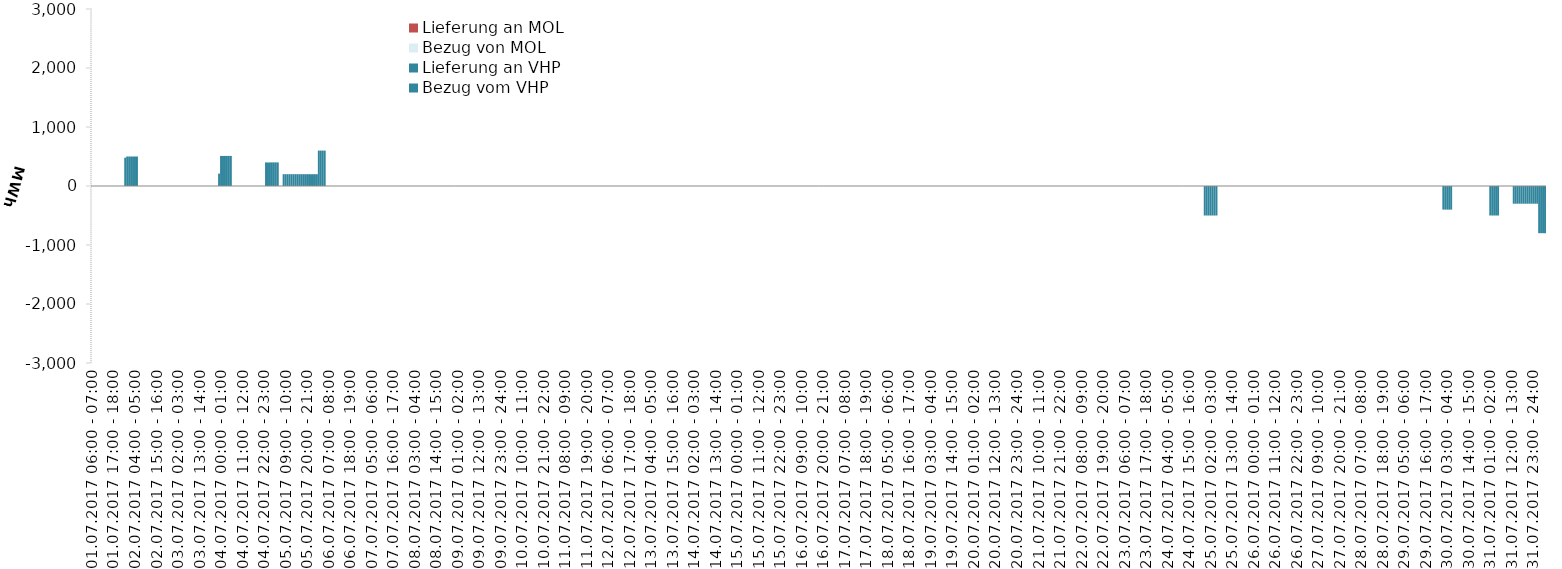
| Category | Bezug vom VHP | Lieferung an VHP | Bezug von MOL | Lieferung an MOL |
|---|---|---|---|---|
| 01.07.2017 06:00 - 07:00 | 0 | 0 | 0 | 0 |
| 01.07.2017 07:00 - 08:00 | 0 | 0 | 0 | 0 |
| 01.07.2017 08:00 - 09:00 | 0 | 0 | 0 | 0 |
| 01.07.2017 09:00 - 10:00 | 0 | 0 | 0 | 0 |
| 01.07.2017 10:00 - 11:00 | 0 | 0 | 0 | 0 |
| 01.07.2017 11:00 - 12:00 | 0 | 0 | 0 | 0 |
| 01.07.2017 12:00 - 13:00 | 0 | 0 | 0 | 0 |
| 01.07.2017 13:00 - 14:00 | 0 | 0 | 0 | 0 |
| 01.07.2017 14:00 - 15:00 | 0 | 0 | 0 | 0 |
| 01.07.2017 15:00 - 16:00 | 0 | 0 | 0 | 0 |
| 01.07.2017 16:00 - 17:00 | 0 | 0 | 0 | 0 |
| 01.07.2017 17:00 - 18:00 | 0 | 0 | 0 | 0 |
| 01.07.2017 18:00 - 19:00 | 0 | 0 | 0 | 0 |
| 01.07.2017 19:00 - 20:00 | 0 | 0 | 0 | 0 |
| 01.07.2017 20:00 - 21:00 | 0 | 0 | 0 | 0 |
| 01.07.2017 21:00 - 22:00 | 0 | 0 | 0 | 0 |
| 01.07.2017 22:00 - 23:00 | 0 | 0 | 0 | 0 |
| 01.07.2017 23:00 - 24:00 | 480 | 0 | 0 | 0 |
| 02.07.2017 00:00 - 01:00 | 500 | 0 | 0 | 0 |
| 02.07.2017 01:00 - 02:00 | 500 | 0 | 0 | 0 |
| 02.07.2017 02:00 - 03:00 | 500 | 0 | 0 | 0 |
| 02.07.2017 03:00 - 04:00 | 500 | 0 | 0 | 0 |
| 02.07.2017 04:00 - 05:00 | 500 | 0 | 0 | 0 |
| 02.07.2017 05:00 - 06:00 | 500 | 0 | 0 | 0 |
| 02.07.2017 06:00 - 07:00 | 0 | 0 | 0 | 0 |
| 02.07.2017 07:00 - 08:00 | 0 | 0 | 0 | 0 |
| 02.07.2017 08:00 - 09:00 | 0 | 0 | 0 | 0 |
| 02.07.2017 09:00 - 10:00 | 0 | 0 | 0 | 0 |
| 02.07.2017 10:00 - 11:00 | 0 | 0 | 0 | 0 |
| 02.07.2017 11:00 - 12:00 | 0 | 0 | 0 | 0 |
| 02.07.2017 12:00 - 13:00 | 0 | 0 | 0 | 0 |
| 02.07.2017 13:00 - 14:00 | 0 | 0 | 0 | 0 |
| 02.07.2017 14:00 - 15:00 | 0 | 0 | 0 | 0 |
| 02.07.2017 15:00 - 16:00 | 0 | 0 | 0 | 0 |
| 02.07.2017 16:00 - 17:00 | 0 | 0 | 0 | 0 |
| 02.07.2017 17:00 - 18:00 | 0 | 0 | 0 | 0 |
| 02.07.2017 18:00 - 19:00 | 0 | 0 | 0 | 0 |
| 02.07.2017 19:00 - 20:00 | 0 | 0 | 0 | 0 |
| 02.07.2017 20:00 - 21:00 | 0 | 0 | 0 | 0 |
| 02.07.2017 21:00 - 22:00 | 0 | 0 | 0 | 0 |
| 02.07.2017 22:00 - 23:00 | 0 | 0 | 0 | 0 |
| 02.07.2017 23:00 - 24:00 | 0 | 0 | 0 | 0 |
| 03.07.2017 00:00 - 01:00 | 0 | 0 | 0 | 0 |
| 03.07.2017 01:00 - 02:00 | 0 | 0 | 0 | 0 |
| 03.07.2017 02:00 - 03:00 | 0 | 0 | 0 | 0 |
| 03.07.2017 03:00 - 04:00 | 0 | 0 | 0 | 0 |
| 03.07.2017 04:00 - 05:00 | 0 | 0 | 0 | 0 |
| 03.07.2017 05:00 - 06:00 | 0 | 0 | 0 | 0 |
| 03.07.2017 06:00 - 07:00 | 0 | 0 | 0 | 0 |
| 03.07.2017 07:00 - 08:00 | 0 | 0 | 0 | 0 |
| 03.07.2017 08:00 - 09:00 | 0 | 0 | 0 | 0 |
| 03.07.2017 09:00 - 10:00 | 0 | 0 | 0 | 0 |
| 03.07.2017 10:00 - 11:00 | 0 | 0 | 0 | 0 |
| 03.07.2017 11:00 - 12:00 | 0 | 0 | 0 | 0 |
| 03.07.2017 12:00 - 13:00 | 0 | 0 | 0 | 0 |
| 03.07.2017 13:00 - 14:00 | 0 | 0 | 0 | 0 |
| 03.07.2017 14:00 - 15:00 | 0 | 0 | 0 | 0 |
| 03.07.2017 15:00 - 16:00 | 0 | 0 | 0 | 0 |
| 03.07.2017 16:00 - 17:00 | 0 | 0 | 0 | 0 |
| 03.07.2017 17:00 - 18:00 | 0 | 0 | 0 | 0 |
| 03.07.2017 18:00 - 19:00 | 0 | 0 | 0 | 0 |
| 03.07.2017 19:00 - 20:00 | 0 | 0 | 0 | 0 |
| 03.07.2017 20:00 - 21:00 | 0 | 0 | 0 | 0 |
| 03.07.2017 21:00 - 22:00 | 0 | 0 | 0 | 0 |
| 03.07.2017 22:00 - 23:00 | 0 | 0 | 0 | 0 |
| 03.07.2017 23:00 - 24:00 | 210 | 0 | 0 | 0 |
| 04.07.2017 00:00 - 01:00 | 510 | 0 | 0 | 0 |
| 04.07.2017 01:00 - 02:00 | 510 | 0 | 0 | 0 |
| 04.07.2017 02:00 - 03:00 | 510 | 0 | 0 | 0 |
| 04.07.2017 03:00 - 04:00 | 510 | 0 | 0 | 0 |
| 04.07.2017 04:00 - 05:00 | 510 | 0 | 0 | 0 |
| 04.07.2017 05:00 - 06:00 | 510 | 0 | 0 | 0 |
| 04.07.2017 06:00 - 07:00 | 0 | 0 | 0 | 0 |
| 04.07.2017 07:00 - 08:00 | 0 | 0 | 0 | 0 |
| 04.07.2017 08:00 - 09:00 | 0 | 0 | 0 | 0 |
| 04.07.2017 09:00 - 10:00 | 0 | 0 | 0 | 0 |
| 04.07.2017 10:00 - 11:00 | 0 | 0 | 0 | 0 |
| 04.07.2017 11:00 - 12:00 | 0 | 0 | 0 | 0 |
| 04.07.2017 12:00 - 13:00 | 0 | 0 | 0 | 0 |
| 04.07.2017 13:00 - 14:00 | 0 | 0 | 0 | 0 |
| 04.07.2017 14:00 - 15:00 | 0 | 0 | 0 | 0 |
| 04.07.2017 15:00 - 16:00 | 0 | 0 | 0 | 0 |
| 04.07.2017 16:00 - 17:00 | 0 | 0 | 0 | 0 |
| 04.07.2017 17:00 - 18:00 | 0 | 0 | 0 | 0 |
| 04.07.2017 18:00 - 19:00 | 0 | 0 | 0 | 0 |
| 04.07.2017 19:00 - 20:00 | 0 | 0 | 0 | 0 |
| 04.07.2017 20:00 - 21:00 | 0 | 0 | 0 | 0 |
| 04.07.2017 21:00 - 22:00 | 0 | 0 | 0 | 0 |
| 04.07.2017 22:00 - 23:00 | 0 | 0 | 0 | 0 |
| 04.07.2017 23:00 - 24:00 | 400 | 0 | 0 | 0 |
| 05.07.2017 00:00 - 01:00 | 400 | 0 | 0 | 0 |
| 05.07.2017 01:00 - 02:00 | 400 | 0 | 0 | 0 |
| 05.07.2017 02:00 - 03:00 | 400 | 0 | 0 | 0 |
| 05.07.2017 03:00 - 04:00 | 400 | 0 | 0 | 0 |
| 05.07.2017 04:00 - 05:00 | 400 | 0 | 0 | 0 |
| 05.07.2017 05:00 - 06:00 | 400 | 0 | 0 | 0 |
| 05.07.2017 06:00 - 07:00 | 0 | 0 | 0 | 0 |
| 05.07.2017 07:00 - 08:00 | 0 | 0 | 0 | 0 |
| 05.07.2017 08:00 - 09:00 | 200 | 0 | 0 | 0 |
| 05.07.2017 09:00 - 10:00 | 200 | 0 | 0 | 0 |
| 05.07.2017 10:00 - 11:00 | 200 | 0 | 0 | 0 |
| 05.07.2017 11:00 - 12:00 | 200 | 0 | 0 | 0 |
| 05.07.2017 12:00 - 13:00 | 200 | 0 | 0 | 0 |
| 05.07.2017 13:00 - 14:00 | 200 | 0 | 0 | 0 |
| 05.07.2017 14:00 - 15:00 | 200 | 0 | 0 | 0 |
| 05.07.2017 15:00 - 16:00 | 200 | 0 | 0 | 0 |
| 05.07.2017 16:00 - 17:00 | 200 | 0 | 0 | 0 |
| 05.07.2017 17:00 - 18:00 | 200 | 0 | 0 | 0 |
| 05.07.2017 18:00 - 19:00 | 200 | 0 | 0 | 0 |
| 05.07.2017 19:00 - 20:00 | 200 | 0 | 0 | 0 |
| 05.07.2017 20:00 - 21:00 | 200 | 0 | 0 | 0 |
| 05.07.2017 21:00 - 22:00 | 200 | 0 | 0 | 0 |
| 05.07.2017 22:00 - 23:00 | 200 | 0 | 0 | 0 |
| 05.07.2017 23:00 - 24:00 | 200 | 0 | 0 | 0 |
| 06.07.2017 00:00 - 01:00 | 200 | 0 | 0 | 0 |
| 06.07.2017 01:00 - 02:00 | 200 | 0 | 0 | 0 |
| 06.07.2017 02:00 - 03:00 | 600 | 0 | 0 | 0 |
| 06.07.2017 03:00 - 04:00 | 600 | 0 | 0 | 0 |
| 06.07.2017 04:00 - 05:00 | 600 | 0 | 0 | 0 |
| 06.07.2017 05:00 - 06:00 | 600 | 0 | 0 | 0 |
| 06.07.2017 06:00 - 07:00 | 0 | 0 | 0 | 0 |
| 06.07.2017 07:00 - 08:00 | 0 | 0 | 0 | 0 |
| 06.07.2017 08:00 - 09:00 | 0 | 0 | 0 | 0 |
| 06.07.2017 09:00 - 10:00 | 0 | 0 | 0 | 0 |
| 06.07.2017 10:00 - 11:00 | 0 | 0 | 0 | 0 |
| 06.07.2017 11:00 - 12:00 | 0 | 0 | 0 | 0 |
| 06.07.2017 12:00 - 13:00 | 0 | 0 | 0 | 0 |
| 06.07.2017 13:00 - 14:00 | 0 | 0 | 0 | 0 |
| 06.07.2017 14:00 - 15:00 | 0 | 0 | 0 | 0 |
| 06.07.2017 15:00 - 16:00 | 0 | 0 | 0 | 0 |
| 06.07.2017 16:00 - 17:00 | 0 | 0 | 0 | 0 |
| 06.07.2017 17:00 - 18:00 | 0 | 0 | 0 | 0 |
| 06.07.2017 18:00 - 19:00 | 0 | 0 | 0 | 0 |
| 06.07.2017 19:00 - 20:00 | 0 | 0 | 0 | 0 |
| 06.07.2017 20:00 - 21:00 | 0 | 0 | 0 | 0 |
| 06.07.2017 21:00 - 22:00 | 0 | 0 | 0 | 0 |
| 06.07.2017 22:00 - 23:00 | 0 | 0 | 0 | 0 |
| 06.07.2017 23:00 - 24:00 | 0 | 0 | 0 | 0 |
| 07.07.2017 00:00 - 01:00 | 0 | 0 | 0 | 0 |
| 07.07.2017 01:00 - 02:00 | 0 | 0 | 0 | 0 |
| 07.07.2017 02:00 - 03:00 | 0 | 0 | 0 | 0 |
| 07.07.2017 03:00 - 04:00 | 0 | 0 | 0 | 0 |
| 07.07.2017 04:00 - 05:00 | 0 | 0 | 0 | 0 |
| 07.07.2017 05:00 - 06:00 | 0 | 0 | 0 | 0 |
| 07.07.2017 06:00 - 07:00 | 0 | 0 | 0 | 0 |
| 07.07.2017 07:00 - 08:00 | 0 | 0 | 0 | 0 |
| 07.07.2017 08:00 - 09:00 | 0 | 0 | 0 | 0 |
| 07.07.2017 09:00 - 10:00 | 0 | 0 | 0 | 0 |
| 07.07.2017 10:00 - 11:00 | 0 | 0 | 0 | 0 |
| 07.07.2017 11:00 - 12:00 | 0 | 0 | 0 | 0 |
| 07.07.2017 12:00 - 13:00 | 0 | 0 | 0 | 0 |
| 07.07.2017 13:00 - 14:00 | 0 | 0 | 0 | 0 |
| 07.07.2017 14:00 - 15:00 | 0 | 0 | 0 | 0 |
| 07.07.2017 15:00 - 16:00 | 0 | 0 | 0 | 0 |
| 07.07.2017 16:00 - 17:00 | 0 | 0 | 0 | 0 |
| 07.07.2017 17:00 - 18:00 | 0 | 0 | 0 | 0 |
| 07.07.2017 18:00 - 19:00 | 0 | 0 | 0 | 0 |
| 07.07.2017 19:00 - 20:00 | 0 | 0 | 0 | 0 |
| 07.07.2017 20:00 - 21:00 | 0 | 0 | 0 | 0 |
| 07.07.2017 21:00 - 22:00 | 0 | 0 | 0 | 0 |
| 07.07.2017 22:00 - 23:00 | 0 | 0 | 0 | 0 |
| 07.07.2017 23:00 - 24:00 | 0 | 0 | 0 | 0 |
| 08.07.2017 00:00 - 01:00 | 0 | 0 | 0 | 0 |
| 08.07.2017 01:00 - 02:00 | 0 | 0 | 0 | 0 |
| 08.07.2017 02:00 - 03:00 | 0 | 0 | 0 | 0 |
| 08.07.2017 03:00 - 04:00 | 0 | 0 | 0 | 0 |
| 08.07.2017 04:00 - 05:00 | 0 | 0 | 0 | 0 |
| 08.07.2017 05:00 - 06:00 | 0 | 0 | 0 | 0 |
| 08.07.2017 06:00 - 07:00 | 0 | 0 | 0 | 0 |
| 08.07.2017 07:00 - 08:00 | 0 | 0 | 0 | 0 |
| 08.07.2017 08:00 - 09:00 | 0 | 0 | 0 | 0 |
| 08.07.2017 09:00 - 10:00 | 0 | 0 | 0 | 0 |
| 08.07.2017 10:00 - 11:00 | 0 | 0 | 0 | 0 |
| 08.07.2017 11:00 - 12:00 | 0 | 0 | 0 | 0 |
| 08.07.2017 12:00 - 13:00 | 0 | 0 | 0 | 0 |
| 08.07.2017 13:00 - 14:00 | 0 | 0 | 0 | 0 |
| 08.07.2017 14:00 - 15:00 | 0 | 0 | 0 | 0 |
| 08.07.2017 15:00 - 16:00 | 0 | 0 | 0 | 0 |
| 08.07.2017 16:00 - 17:00 | 0 | 0 | 0 | 0 |
| 08.07.2017 17:00 - 18:00 | 0 | 0 | 0 | 0 |
| 08.07.2017 18:00 - 19:00 | 0 | 0 | 0 | 0 |
| 08.07.2017 19:00 - 20:00 | 0 | 0 | 0 | 0 |
| 08.07.2017 20:00 - 21:00 | 0 | 0 | 0 | 0 |
| 08.07.2017 21:00 - 22:00 | 0 | 0 | 0 | 0 |
| 08.07.2017 22:00 - 23:00 | 0 | 0 | 0 | 0 |
| 08.07.2017 23:00 - 24:00 | 0 | 0 | 0 | 0 |
| 09.07.2017 00:00 - 01:00 | 0 | 0 | 0 | 0 |
| 09.07.2017 01:00 - 02:00 | 0 | 0 | 0 | 0 |
| 09.07.2017 02:00 - 03:00 | 0 | 0 | 0 | 0 |
| 09.07.2017 03:00 - 04:00 | 0 | 0 | 0 | 0 |
| 09.07.2017 04:00 - 05:00 | 0 | 0 | 0 | 0 |
| 09.07.2017 05:00 - 06:00 | 0 | 0 | 0 | 0 |
| 09.07.2017 06:00 - 07:00 | 0 | 0 | 0 | 0 |
| 09.07.2017 07:00 - 08:00 | 0 | 0 | 0 | 0 |
| 09.07.2017 08:00 - 09:00 | 0 | 0 | 0 | 0 |
| 09.07.2017 09:00 - 10:00 | 0 | 0 | 0 | 0 |
| 09.07.2017 10:00 - 11:00 | 0 | 0 | 0 | 0 |
| 09.07.2017 11:00 - 12:00 | 0 | 0 | 0 | 0 |
| 09.07.2017 12:00 - 13:00 | 0 | 0 | 0 | 0 |
| 09.07.2017 13:00 - 14:00 | 0 | 0 | 0 | 0 |
| 09.07.2017 14:00 - 15:00 | 0 | 0 | 0 | 0 |
| 09.07.2017 15:00 - 16:00 | 0 | 0 | 0 | 0 |
| 09.07.2017 16:00 - 17:00 | 0 | 0 | 0 | 0 |
| 09.07.2017 17:00 - 18:00 | 0 | 0 | 0 | 0 |
| 09.07.2017 18:00 - 19:00 | 0 | 0 | 0 | 0 |
| 09.07.2017 19:00 - 20:00 | 0 | 0 | 0 | 0 |
| 09.07.2017 20:00 - 21:00 | 0 | 0 | 0 | 0 |
| 09.07.2017 21:00 - 22:00 | 0 | 0 | 0 | 0 |
| 09.07.2017 22:00 - 23:00 | 0 | 0 | 0 | 0 |
| 09.07.2017 23:00 - 24:00 | 0 | 0 | 0 | 0 |
| 10.07.2017 00:00 - 01:00 | 0 | 0 | 0 | 0 |
| 10.07.2017 01:00 - 02:00 | 0 | 0 | 0 | 0 |
| 10.07.2017 02:00 - 03:00 | 0 | 0 | 0 | 0 |
| 10.07.2017 03:00 - 04:00 | 0 | 0 | 0 | 0 |
| 10.07.2017 04:00 - 05:00 | 0 | 0 | 0 | 0 |
| 10.07.2017 05:00 - 06:00 | 0 | 0 | 0 | 0 |
| 10.07.2017 06:00 - 07:00 | 0 | 0 | 0 | 0 |
| 10.07.2017 07:00 - 08:00 | 0 | 0 | 0 | 0 |
| 10.07.2017 08:00 - 09:00 | 0 | 0 | 0 | 0 |
| 10.07.2017 09:00 - 10:00 | 0 | 0 | 0 | 0 |
| 10.07.2017 10:00 - 11:00 | 0 | 0 | 0 | 0 |
| 10.07.2017 11:00 - 12:00 | 0 | 0 | 0 | 0 |
| 10.07.2017 12:00 - 13:00 | 0 | 0 | 0 | 0 |
| 10.07.2017 13:00 - 14:00 | 0 | 0 | 0 | 0 |
| 10.07.2017 14:00 - 15:00 | 0 | 0 | 0 | 0 |
| 10.07.2017 15:00 - 16:00 | 0 | 0 | 0 | 0 |
| 10.07.2017 16:00 - 17:00 | 0 | 0 | 0 | 0 |
| 10.07.2017 17:00 - 18:00 | 0 | 0 | 0 | 0 |
| 10.07.2017 18:00 - 19:00 | 0 | 0 | 0 | 0 |
| 10.07.2017 19:00 - 20:00 | 0 | 0 | 0 | 0 |
| 10.07.2017 20:00 - 21:00 | 0 | 0 | 0 | 0 |
| 10.07.2017 21:00 - 22:00 | 0 | 0 | 0 | 0 |
| 10.07.2017 22:00 - 23:00 | 0 | 0 | 0 | 0 |
| 10.07.2017 23:00 - 24:00 | 0 | 0 | 0 | 0 |
| 11.07.2017 00:00 - 01:00 | 0 | 0 | 0 | 0 |
| 11.07.2017 01:00 - 02:00 | 0 | 0 | 0 | 0 |
| 11.07.2017 02:00 - 03:00 | 0 | 0 | 0 | 0 |
| 11.07.2017 03:00 - 04:00 | 0 | 0 | 0 | 0 |
| 11.07.2017 04:00 - 05:00 | 0 | 0 | 0 | 0 |
| 11.07.2017 05:00 - 06:00 | 0 | 0 | 0 | 0 |
| 11.07.2017 06:00 - 07:00 | 0 | 0 | 0 | 0 |
| 11.07.2017 07:00 - 08:00 | 0 | 0 | 0 | 0 |
| 11.07.2017 08:00 - 09:00 | 0 | 0 | 0 | 0 |
| 11.07.2017 09:00 - 10:00 | 0 | 0 | 0 | 0 |
| 11.07.2017 10:00 - 11:00 | 0 | 0 | 0 | 0 |
| 11.07.2017 11:00 - 12:00 | 0 | 0 | 0 | 0 |
| 11.07.2017 12:00 - 13:00 | 0 | 0 | 0 | 0 |
| 11.07.2017 13:00 - 14:00 | 0 | 0 | 0 | 0 |
| 11.07.2017 14:00 - 15:00 | 0 | 0 | 0 | 0 |
| 11.07.2017 15:00 - 16:00 | 0 | 0 | 0 | 0 |
| 11.07.2017 16:00 - 17:00 | 0 | 0 | 0 | 0 |
| 11.07.2017 17:00 - 18:00 | 0 | 0 | 0 | 0 |
| 11.07.2017 18:00 - 19:00 | 0 | 0 | 0 | 0 |
| 11.07.2017 19:00 - 20:00 | 0 | 0 | 0 | 0 |
| 11.07.2017 20:00 - 21:00 | 0 | 0 | 0 | 0 |
| 11.07.2017 21:00 - 22:00 | 0 | 0 | 0 | 0 |
| 11.07.2017 22:00 - 23:00 | 0 | 0 | 0 | 0 |
| 11.07.2017 23:00 - 24:00 | 0 | 0 | 0 | 0 |
| 12.07.2017 00:00 - 01:00 | 0 | 0 | 0 | 0 |
| 12.07.2017 01:00 - 02:00 | 0 | 0 | 0 | 0 |
| 12.07.2017 02:00 - 03:00 | 0 | 0 | 0 | 0 |
| 12.07.2017 03:00 - 04:00 | 0 | 0 | 0 | 0 |
| 12.07.2017 04:00 - 05:00 | 0 | 0 | 0 | 0 |
| 12.07.2017 05:00 - 06:00 | 0 | 0 | 0 | 0 |
| 12.07.2017 06:00 - 07:00 | 0 | 0 | 0 | 0 |
| 12.07.2017 07:00 - 08:00 | 0 | 0 | 0 | 0 |
| 12.07.2017 08:00 - 09:00 | 0 | 0 | 0 | 0 |
| 12.07.2017 09:00 - 10:00 | 0 | 0 | 0 | 0 |
| 12.07.2017 10:00 - 11:00 | 0 | 0 | 0 | 0 |
| 12.07.2017 11:00 - 12:00 | 0 | 0 | 0 | 0 |
| 12.07.2017 12:00 - 13:00 | 0 | 0 | 0 | 0 |
| 12.07.2017 13:00 - 14:00 | 0 | 0 | 0 | 0 |
| 12.07.2017 14:00 - 15:00 | 0 | 0 | 0 | 0 |
| 12.07.2017 15:00 - 16:00 | 0 | 0 | 0 | 0 |
| 12.07.2017 16:00 - 17:00 | 0 | 0 | 0 | 0 |
| 12.07.2017 17:00 - 18:00 | 0 | 0 | 0 | 0 |
| 12.07.2017 18:00 - 19:00 | 0 | 0 | 0 | 0 |
| 12.07.2017 19:00 - 20:00 | 0 | 0 | 0 | 0 |
| 12.07.2017 20:00 - 21:00 | 0 | 0 | 0 | 0 |
| 12.07.2017 21:00 - 22:00 | 0 | 0 | 0 | 0 |
| 12.07.2017 22:00 - 23:00 | 0 | 0 | 0 | 0 |
| 12.07.2017 23:00 - 24:00 | 0 | 0 | 0 | 0 |
| 13.07.2017 00:00 - 01:00 | 0 | 0 | 0 | 0 |
| 13.07.2017 01:00 - 02:00 | 0 | 0 | 0 | 0 |
| 13.07.2017 02:00 - 03:00 | 0 | 0 | 0 | 0 |
| 13.07.2017 03:00 - 04:00 | 0 | 0 | 0 | 0 |
| 13.07.2017 04:00 - 05:00 | 0 | 0 | 0 | 0 |
| 13.07.2017 05:00 - 06:00 | 0 | 0 | 0 | 0 |
| 13.07.2017 06:00 - 07:00 | 0 | 0 | 0 | 0 |
| 13.07.2017 07:00 - 08:00 | 0 | 0 | 0 | 0 |
| 13.07.2017 08:00 - 09:00 | 0 | 0 | 0 | 0 |
| 13.07.2017 09:00 - 10:00 | 0 | 0 | 0 | 0 |
| 13.07.2017 10:00 - 11:00 | 0 | 0 | 0 | 0 |
| 13.07.2017 11:00 - 12:00 | 0 | 0 | 0 | 0 |
| 13.07.2017 12:00 - 13:00 | 0 | 0 | 0 | 0 |
| 13.07.2017 13:00 - 14:00 | 0 | 0 | 0 | 0 |
| 13.07.2017 14:00 - 15:00 | 0 | 0 | 0 | 0 |
| 13.07.2017 15:00 - 16:00 | 0 | 0 | 0 | 0 |
| 13.07.2017 16:00 - 17:00 | 0 | 0 | 0 | 0 |
| 13.07.2017 17:00 - 18:00 | 0 | 0 | 0 | 0 |
| 13.07.2017 18:00 - 19:00 | 0 | 0 | 0 | 0 |
| 13.07.2017 19:00 - 20:00 | 0 | 0 | 0 | 0 |
| 13.07.2017 20:00 - 21:00 | 0 | 0 | 0 | 0 |
| 13.07.2017 21:00 - 22:00 | 0 | 0 | 0 | 0 |
| 13.07.2017 22:00 - 23:00 | 0 | 0 | 0 | 0 |
| 13.07.2017 23:00 - 24:00 | 0 | 0 | 0 | 0 |
| 14.07.2017 00:00 - 01:00 | 0 | 0 | 0 | 0 |
| 14.07.2017 01:00 - 02:00 | 0 | 0 | 0 | 0 |
| 14.07.2017 02:00 - 03:00 | 0 | 0 | 0 | 0 |
| 14.07.2017 03:00 - 04:00 | 0 | 0 | 0 | 0 |
| 14.07.2017 04:00 - 05:00 | 0 | 0 | 0 | 0 |
| 14.07.2017 05:00 - 06:00 | 0 | 0 | 0 | 0 |
| 14.07.2017 06:00 - 07:00 | 0 | 0 | 0 | 0 |
| 14.07.2017 07:00 - 08:00 | 0 | 0 | 0 | 0 |
| 14.07.2017 08:00 - 09:00 | 0 | 0 | 0 | 0 |
| 14.07.2017 09:00 - 10:00 | 0 | 0 | 0 | 0 |
| 14.07.2017 10:00 - 11:00 | 0 | 0 | 0 | 0 |
| 14.07.2017 11:00 - 12:00 | 0 | 0 | 0 | 0 |
| 14.07.2017 12:00 - 13:00 | 0 | 0 | 0 | 0 |
| 14.07.2017 13:00 - 14:00 | 0 | 0 | 0 | 0 |
| 14.07.2017 14:00 - 15:00 | 0 | 0 | 0 | 0 |
| 14.07.2017 15:00 - 16:00 | 0 | 0 | 0 | 0 |
| 14.07.2017 16:00 - 17:00 | 0 | 0 | 0 | 0 |
| 14.07.2017 17:00 - 18:00 | 0 | 0 | 0 | 0 |
| 14.07.2017 18:00 - 19:00 | 0 | 0 | 0 | 0 |
| 14.07.2017 19:00 - 20:00 | 0 | 0 | 0 | 0 |
| 14.07.2017 20:00 - 21:00 | 0 | 0 | 0 | 0 |
| 14.07.2017 21:00 - 22:00 | 0 | 0 | 0 | 0 |
| 14.07.2017 22:00 - 23:00 | 0 | 0 | 0 | 0 |
| 14.07.2017 23:00 - 24:00 | 0 | 0 | 0 | 0 |
| 15.07.2017 00:00 - 01:00 | 0 | 0 | 0 | 0 |
| 15.07.2017 01:00 - 02:00 | 0 | 0 | 0 | 0 |
| 15.07.2017 02:00 - 03:00 | 0 | 0 | 0 | 0 |
| 15.07.2017 03:00 - 04:00 | 0 | 0 | 0 | 0 |
| 15.07.2017 04:00 - 05:00 | 0 | 0 | 0 | 0 |
| 15.07.2017 05:00 - 06:00 | 0 | 0 | 0 | 0 |
| 15.07.2017 06:00 - 07:00 | 0 | 0 | 0 | 0 |
| 15.07.2017 07:00 - 08:00 | 0 | 0 | 0 | 0 |
| 15.07.2017 08:00 - 09:00 | 0 | 0 | 0 | 0 |
| 15.07.2017 09:00 - 10:00 | 0 | 0 | 0 | 0 |
| 15.07.2017 10:00 - 11:00 | 0 | 0 | 0 | 0 |
| 15.07.2017 11:00 - 12:00 | 0 | 0 | 0 | 0 |
| 15.07.2017 12:00 - 13:00 | 0 | 0 | 0 | 0 |
| 15.07.2017 13:00 - 14:00 | 0 | 0 | 0 | 0 |
| 15.07.2017 14:00 - 15:00 | 0 | 0 | 0 | 0 |
| 15.07.2017 15:00 - 16:00 | 0 | 0 | 0 | 0 |
| 15.07.2017 16:00 - 17:00 | 0 | 0 | 0 | 0 |
| 15.07.2017 17:00 - 18:00 | 0 | 0 | 0 | 0 |
| 15.07.2017 18:00 - 19:00 | 0 | 0 | 0 | 0 |
| 15.07.2017 19:00 - 20:00 | 0 | 0 | 0 | 0 |
| 15.07.2017 20:00 - 21:00 | 0 | 0 | 0 | 0 |
| 15.07.2017 21:00 - 22:00 | 0 | 0 | 0 | 0 |
| 15.07.2017 22:00 - 23:00 | 0 | 0 | 0 | 0 |
| 15.07.2017 23:00 - 24:00 | 0 | 0 | 0 | 0 |
| 16.07.2017 00:00 - 01:00 | 0 | 0 | 0 | 0 |
| 16.07.2017 01:00 - 02:00 | 0 | 0 | 0 | 0 |
| 16.07.2017 02:00 - 03:00 | 0 | 0 | 0 | 0 |
| 16.07.2017 03:00 - 04:00 | 0 | 0 | 0 | 0 |
| 16.07.2017 04:00 - 05:00 | 0 | 0 | 0 | 0 |
| 16.07.2017 05:00 - 06:00 | 0 | 0 | 0 | 0 |
| 16.07.2017 06:00 - 07:00 | 0 | 0 | 0 | 0 |
| 16.07.2017 07:00 - 08:00 | 0 | 0 | 0 | 0 |
| 16.07.2017 08:00 - 09:00 | 0 | 0 | 0 | 0 |
| 16.07.2017 09:00 - 10:00 | 0 | 0 | 0 | 0 |
| 16.07.2017 10:00 - 11:00 | 0 | 0 | 0 | 0 |
| 16.07.2017 11:00 - 12:00 | 0 | 0 | 0 | 0 |
| 16.07.2017 12:00 - 13:00 | 0 | 0 | 0 | 0 |
| 16.07.2017 13:00 - 14:00 | 0 | 0 | 0 | 0 |
| 16.07.2017 14:00 - 15:00 | 0 | 0 | 0 | 0 |
| 16.07.2017 15:00 - 16:00 | 0 | 0 | 0 | 0 |
| 16.07.2017 16:00 - 17:00 | 0 | 0 | 0 | 0 |
| 16.07.2017 17:00 - 18:00 | 0 | 0 | 0 | 0 |
| 16.07.2017 18:00 - 19:00 | 0 | 0 | 0 | 0 |
| 16.07.2017 19:00 - 20:00 | 0 | 0 | 0 | 0 |
| 16.07.2017 20:00 - 21:00 | 0 | 0 | 0 | 0 |
| 16.07.2017 21:00 - 22:00 | 0 | 0 | 0 | 0 |
| 16.07.2017 22:00 - 23:00 | 0 | 0 | 0 | 0 |
| 16.07.2017 23:00 - 24:00 | 0 | 0 | 0 | 0 |
| 17.07.2017 00:00 - 01:00 | 0 | 0 | 0 | 0 |
| 17.07.2017 01:00 - 02:00 | 0 | 0 | 0 | 0 |
| 17.07.2017 02:00 - 03:00 | 0 | 0 | 0 | 0 |
| 17.07.2017 03:00 - 04:00 | 0 | 0 | 0 | 0 |
| 17.07.2017 04:00 - 05:00 | 0 | 0 | 0 | 0 |
| 17.07.2017 05:00 - 06:00 | 0 | 0 | 0 | 0 |
| 17.07.2017 06:00 - 07:00 | 0 | 0 | 0 | 0 |
| 17.07.2017 07:00 - 08:00 | 0 | 0 | 0 | 0 |
| 17.07.2017 08:00 - 09:00 | 0 | 0 | 0 | 0 |
| 17.07.2017 09:00 - 10:00 | 0 | 0 | 0 | 0 |
| 17.07.2017 10:00 - 11:00 | 0 | 0 | 0 | 0 |
| 17.07.2017 11:00 - 12:00 | 0 | 0 | 0 | 0 |
| 17.07.2017 12:00 - 13:00 | 0 | 0 | 0 | 0 |
| 17.07.2017 13:00 - 14:00 | 0 | 0 | 0 | 0 |
| 17.07.2017 14:00 - 15:00 | 0 | 0 | 0 | 0 |
| 17.07.2017 15:00 - 16:00 | 0 | 0 | 0 | 0 |
| 17.07.2017 16:00 - 17:00 | 0 | 0 | 0 | 0 |
| 17.07.2017 17:00 - 18:00 | 0 | 0 | 0 | 0 |
| 17.07.2017 18:00 - 19:00 | 0 | 0 | 0 | 0 |
| 17.07.2017 19:00 - 20:00 | 0 | 0 | 0 | 0 |
| 17.07.2017 20:00 - 21:00 | 0 | 0 | 0 | 0 |
| 17.07.2017 21:00 - 22:00 | 0 | 0 | 0 | 0 |
| 17.07.2017 22:00 - 23:00 | 0 | 0 | 0 | 0 |
| 17.07.2017 23:00 - 24:00 | 0 | 0 | 0 | 0 |
| 18.07.2017 00:00 - 01:00 | 0 | 0 | 0 | 0 |
| 18.07.2017 01:00 - 02:00 | 0 | 0 | 0 | 0 |
| 18.07.2017 02:00 - 03:00 | 0 | 0 | 0 | 0 |
| 18.07.2017 03:00 - 04:00 | 0 | 0 | 0 | 0 |
| 18.07.2017 04:00 - 05:00 | 0 | 0 | 0 | 0 |
| 18.07.2017 05:00 - 06:00 | 0 | 0 | 0 | 0 |
| 18.07.2017 06:00 - 07:00 | 0 | 0 | 0 | 0 |
| 18.07.2017 07:00 - 08:00 | 0 | 0 | 0 | 0 |
| 18.07.2017 08:00 - 09:00 | 0 | 0 | 0 | 0 |
| 18.07.2017 09:00 - 10:00 | 0 | 0 | 0 | 0 |
| 18.07.2017 10:00 - 11:00 | 0 | 0 | 0 | 0 |
| 18.07.2017 11:00 - 12:00 | 0 | 0 | 0 | 0 |
| 18.07.2017 12:00 - 13:00 | 0 | 0 | 0 | 0 |
| 18.07.2017 13:00 - 14:00 | 0 | 0 | 0 | 0 |
| 18.07.2017 14:00 - 15:00 | 0 | 0 | 0 | 0 |
| 18.07.2017 15:00 - 16:00 | 0 | 0 | 0 | 0 |
| 18.07.2017 16:00 - 17:00 | 0 | 0 | 0 | 0 |
| 18.07.2017 17:00 - 18:00 | 0 | 0 | 0 | 0 |
| 18.07.2017 18:00 - 19:00 | 0 | 0 | 0 | 0 |
| 18.07.2017 19:00 - 20:00 | 0 | 0 | 0 | 0 |
| 18.07.2017 20:00 - 21:00 | 0 | 0 | 0 | 0 |
| 18.07.2017 21:00 - 22:00 | 0 | 0 | 0 | 0 |
| 18.07.2017 22:00 - 23:00 | 0 | 0 | 0 | 0 |
| 18.07.2017 23:00 - 24:00 | 0 | 0 | 0 | 0 |
| 19.07.2017 00:00 - 01:00 | 0 | 0 | 0 | 0 |
| 19.07.2017 01:00 - 02:00 | 0 | 0 | 0 | 0 |
| 19.07.2017 02:00 - 03:00 | 0 | 0 | 0 | 0 |
| 19.07.2017 03:00 - 04:00 | 0 | 0 | 0 | 0 |
| 19.07.2017 04:00 - 05:00 | 0 | 0 | 0 | 0 |
| 19.07.2017 05:00 - 06:00 | 0 | 0 | 0 | 0 |
| 19.07.2017 06:00 - 07:00 | 0 | 0 | 0 | 0 |
| 19.07.2017 07:00 - 08:00 | 0 | 0 | 0 | 0 |
| 19.07.2017 08:00 - 09:00 | 0 | 0 | 0 | 0 |
| 19.07.2017 09:00 - 10:00 | 0 | 0 | 0 | 0 |
| 19.07.2017 10:00 - 11:00 | 0 | 0 | 0 | 0 |
| 19.07.2017 11:00 - 12:00 | 0 | 0 | 0 | 0 |
| 19.07.2017 12:00 - 13:00 | 0 | 0 | 0 | 0 |
| 19.07.2017 13:00 - 14:00 | 0 | 0 | 0 | 0 |
| 19.07.2017 14:00 - 15:00 | 0 | 0 | 0 | 0 |
| 19.07.2017 15:00 - 16:00 | 0 | 0 | 0 | 0 |
| 19.07.2017 16:00 - 17:00 | 0 | 0 | 0 | 0 |
| 19.07.2017 17:00 - 18:00 | 0 | 0 | 0 | 0 |
| 19.07.2017 18:00 - 19:00 | 0 | 0 | 0 | 0 |
| 19.07.2017 19:00 - 20:00 | 0 | 0 | 0 | 0 |
| 19.07.2017 20:00 - 21:00 | 0 | 0 | 0 | 0 |
| 19.07.2017 21:00 - 22:00 | 0 | 0 | 0 | 0 |
| 19.07.2017 22:00 - 23:00 | 0 | 0 | 0 | 0 |
| 19.07.2017 23:00 - 24:00 | 0 | 0 | 0 | 0 |
| 20.07.2017 00:00 - 01:00 | 0 | 0 | 0 | 0 |
| 20.07.2017 01:00 - 02:00 | 0 | 0 | 0 | 0 |
| 20.07.2017 02:00 - 03:00 | 0 | 0 | 0 | 0 |
| 20.07.2017 03:00 - 04:00 | 0 | 0 | 0 | 0 |
| 20.07.2017 04:00 - 05:00 | 0 | 0 | 0 | 0 |
| 20.07.2017 05:00 - 06:00 | 0 | 0 | 0 | 0 |
| 20.07.2017 06:00 - 07:00 | 0 | 0 | 0 | 0 |
| 20.07.2017 07:00 - 08:00 | 0 | 0 | 0 | 0 |
| 20.07.2017 08:00 - 09:00 | 0 | 0 | 0 | 0 |
| 20.07.2017 09:00 - 10:00 | 0 | 0 | 0 | 0 |
| 20.07.2017 10:00 - 11:00 | 0 | 0 | 0 | 0 |
| 20.07.2017 11:00 - 12:00 | 0 | 0 | 0 | 0 |
| 20.07.2017 12:00 - 13:00 | 0 | 0 | 0 | 0 |
| 20.07.2017 13:00 - 14:00 | 0 | 0 | 0 | 0 |
| 20.07.2017 14:00 - 15:00 | 0 | 0 | 0 | 0 |
| 20.07.2017 15:00 - 16:00 | 0 | 0 | 0 | 0 |
| 20.07.2017 16:00 - 17:00 | 0 | 0 | 0 | 0 |
| 20.07.2017 17:00 - 18:00 | 0 | 0 | 0 | 0 |
| 20.07.2017 18:00 - 19:00 | 0 | 0 | 0 | 0 |
| 20.07.2017 19:00 - 20:00 | 0 | 0 | 0 | 0 |
| 20.07.2017 20:00 - 21:00 | 0 | 0 | 0 | 0 |
| 20.07.2017 21:00 - 22:00 | 0 | 0 | 0 | 0 |
| 20.07.2017 22:00 - 23:00 | 0 | 0 | 0 | 0 |
| 20.07.2017 23:00 - 24:00 | 0 | 0 | 0 | 0 |
| 21.07.2017 00:00 - 01:00 | 0 | 0 | 0 | 0 |
| 21.07.2017 01:00 - 02:00 | 0 | 0 | 0 | 0 |
| 21.07.2017 02:00 - 03:00 | 0 | 0 | 0 | 0 |
| 21.07.2017 03:00 - 04:00 | 0 | 0 | 0 | 0 |
| 21.07.2017 04:00 - 05:00 | 0 | 0 | 0 | 0 |
| 21.07.2017 05:00 - 06:00 | 0 | 0 | 0 | 0 |
| 21.07.2017 06:00 - 07:00 | 0 | 0 | 0 | 0 |
| 21.07.2017 07:00 - 08:00 | 0 | 0 | 0 | 0 |
| 21.07.2017 08:00 - 09:00 | 0 | 0 | 0 | 0 |
| 21.07.2017 09:00 - 10:00 | 0 | 0 | 0 | 0 |
| 21.07.2017 10:00 - 11:00 | 0 | 0 | 0 | 0 |
| 21.07.2017 11:00 - 12:00 | 0 | 0 | 0 | 0 |
| 21.07.2017 12:00 - 13:00 | 0 | 0 | 0 | 0 |
| 21.07.2017 13:00 - 14:00 | 0 | 0 | 0 | 0 |
| 21.07.2017 14:00 - 15:00 | 0 | 0 | 0 | 0 |
| 21.07.2017 15:00 - 16:00 | 0 | 0 | 0 | 0 |
| 21.07.2017 16:00 - 17:00 | 0 | 0 | 0 | 0 |
| 21.07.2017 17:00 - 18:00 | 0 | 0 | 0 | 0 |
| 21.07.2017 18:00 - 19:00 | 0 | 0 | 0 | 0 |
| 21.07.2017 19:00 - 20:00 | 0 | 0 | 0 | 0 |
| 21.07.2017 20:00 - 21:00 | 0 | 0 | 0 | 0 |
| 21.07.2017 21:00 - 22:00 | 0 | 0 | 0 | 0 |
| 21.07.2017 22:00 - 23:00 | 0 | 0 | 0 | 0 |
| 21.07.2017 23:00 - 24:00 | 0 | 0 | 0 | 0 |
| 22.07.2017 00:00 - 01:00 | 0 | 0 | 0 | 0 |
| 22.07.2017 01:00 - 02:00 | 0 | 0 | 0 | 0 |
| 22.07.2017 02:00 - 03:00 | 0 | 0 | 0 | 0 |
| 22.07.2017 03:00 - 04:00 | 0 | 0 | 0 | 0 |
| 22.07.2017 04:00 - 05:00 | 0 | 0 | 0 | 0 |
| 22.07.2017 05:00 - 06:00 | 0 | 0 | 0 | 0 |
| 22.07.2017 06:00 - 07:00 | 0 | 0 | 0 | 0 |
| 22.07.2017 07:00 - 08:00 | 0 | 0 | 0 | 0 |
| 22.07.2017 08:00 - 09:00 | 0 | 0 | 0 | 0 |
| 22.07.2017 09:00 - 10:00 | 0 | 0 | 0 | 0 |
| 22.07.2017 10:00 - 11:00 | 0 | 0 | 0 | 0 |
| 22.07.2017 11:00 - 12:00 | 0 | 0 | 0 | 0 |
| 22.07.2017 12:00 - 13:00 | 0 | 0 | 0 | 0 |
| 22.07.2017 13:00 - 14:00 | 0 | 0 | 0 | 0 |
| 22.07.2017 14:00 - 15:00 | 0 | 0 | 0 | 0 |
| 22.07.2017 15:00 - 16:00 | 0 | 0 | 0 | 0 |
| 22.07.2017 16:00 - 17:00 | 0 | 0 | 0 | 0 |
| 22.07.2017 17:00 - 18:00 | 0 | 0 | 0 | 0 |
| 22.07.2017 18:00 - 19:00 | 0 | 0 | 0 | 0 |
| 22.07.2017 19:00 - 20:00 | 0 | 0 | 0 | 0 |
| 22.07.2017 20:00 - 21:00 | 0 | 0 | 0 | 0 |
| 22.07.2017 21:00 - 22:00 | 0 | 0 | 0 | 0 |
| 22.07.2017 22:00 - 23:00 | 0 | 0 | 0 | 0 |
| 22.07.2017 23:00 - 24:00 | 0 | 0 | 0 | 0 |
| 23.07.2017 00:00 - 01:00 | 0 | 0 | 0 | 0 |
| 23.07.2017 01:00 - 02:00 | 0 | 0 | 0 | 0 |
| 23.07.2017 02:00 - 03:00 | 0 | 0 | 0 | 0 |
| 23.07.2017 03:00 - 04:00 | 0 | 0 | 0 | 0 |
| 23.07.2017 04:00 - 05:00 | 0 | 0 | 0 | 0 |
| 23.07.2017 05:00 - 06:00 | 0 | 0 | 0 | 0 |
| 23.07.2017 06:00 - 07:00 | 0 | 0 | 0 | 0 |
| 23.07.2017 07:00 - 08:00 | 0 | 0 | 0 | 0 |
| 23.07.2017 08:00 - 09:00 | 0 | 0 | 0 | 0 |
| 23.07.2017 09:00 - 10:00 | 0 | 0 | 0 | 0 |
| 23.07.2017 10:00 - 11:00 | 0 | 0 | 0 | 0 |
| 23.07.2017 11:00 - 12:00 | 0 | 0 | 0 | 0 |
| 23.07.2017 12:00 - 13:00 | 0 | 0 | 0 | 0 |
| 23.07.2017 13:00 - 14:00 | 0 | 0 | 0 | 0 |
| 23.07.2017 14:00 - 15:00 | 0 | 0 | 0 | 0 |
| 23.07.2017 15:00 - 16:00 | 0 | 0 | 0 | 0 |
| 23.07.2017 16:00 - 17:00 | 0 | 0 | 0 | 0 |
| 23.07.2017 17:00 - 18:00 | 0 | 0 | 0 | 0 |
| 23.07.2017 18:00 - 19:00 | 0 | 0 | 0 | 0 |
| 23.07.2017 19:00 - 20:00 | 0 | 0 | 0 | 0 |
| 23.07.2017 20:00 - 21:00 | 0 | 0 | 0 | 0 |
| 23.07.2017 21:00 - 22:00 | 0 | 0 | 0 | 0 |
| 23.07.2017 22:00 - 23:00 | 0 | 0 | 0 | 0 |
| 23.07.2017 23:00 - 24:00 | 0 | 0 | 0 | 0 |
| 24.07.2017 00:00 - 01:00 | 0 | 0 | 0 | 0 |
| 24.07.2017 01:00 - 02:00 | 0 | 0 | 0 | 0 |
| 24.07.2017 02:00 - 03:00 | 0 | 0 | 0 | 0 |
| 24.07.2017 03:00 - 04:00 | 0 | 0 | 0 | 0 |
| 24.07.2017 04:00 - 05:00 | 0 | 0 | 0 | 0 |
| 24.07.2017 05:00 - 06:00 | 0 | 0 | 0 | 0 |
| 24.07.2017 06:00 - 07:00 | 0 | 0 | 0 | 0 |
| 24.07.2017 07:00 - 08:00 | 0 | 0 | 0 | 0 |
| 24.07.2017 08:00 - 09:00 | 0 | 0 | 0 | 0 |
| 24.07.2017 09:00 - 10:00 | 0 | 0 | 0 | 0 |
| 24.07.2017 10:00 - 11:00 | 0 | 0 | 0 | 0 |
| 24.07.2017 11:00 - 12:00 | 0 | 0 | 0 | 0 |
| 24.07.2017 12:00 - 13:00 | 0 | 0 | 0 | 0 |
| 24.07.2017 13:00 - 14:00 | 0 | 0 | 0 | 0 |
| 24.07.2017 14:00 - 15:00 | 0 | 0 | 0 | 0 |
| 24.07.2017 15:00 - 16:00 | 0 | 0 | 0 | 0 |
| 24.07.2017 16:00 - 17:00 | 0 | 0 | 0 | 0 |
| 24.07.2017 17:00 - 18:00 | 0 | 0 | 0 | 0 |
| 24.07.2017 18:00 - 19:00 | 0 | 0 | 0 | 0 |
| 24.07.2017 19:00 - 20:00 | 0 | 0 | 0 | 0 |
| 24.07.2017 20:00 - 21:00 | 0 | 0 | 0 | 0 |
| 24.07.2017 21:00 - 22:00 | 0 | 0 | 0 | 0 |
| 24.07.2017 22:00 - 23:00 | 0 | 0 | 0 | 0 |
| 24.07.2017 23:00 - 24:00 | 0 | -500 | 0 | 0 |
| 25.07.2017 00:00 - 01:00 | 0 | -500 | 0 | 0 |
| 25.07.2017 01:00 - 02:00 | 0 | -500 | 0 | 0 |
| 25.07.2017 02:00 - 03:00 | 0 | -500 | 0 | 0 |
| 25.07.2017 03:00 - 04:00 | 0 | -500 | 0 | 0 |
| 25.07.2017 04:00 - 05:00 | 0 | -500 | 0 | 0 |
| 25.07.2017 05:00 - 06:00 | 0 | -500 | 0 | 0 |
| 25.07.2017 06:00 - 07:00 | 0 | 0 | 0 | 0 |
| 25.07.2017 07:00 - 08:00 | 0 | 0 | 0 | 0 |
| 25.07.2017 08:00 - 09:00 | 0 | 0 | 0 | 0 |
| 25.07.2017 09:00 - 10:00 | 0 | 0 | 0 | 0 |
| 25.07.2017 10:00 - 11:00 | 0 | 0 | 0 | 0 |
| 25.07.2017 11:00 - 12:00 | 0 | 0 | 0 | 0 |
| 25.07.2017 12:00 - 13:00 | 0 | 0 | 0 | 0 |
| 25.07.2017 13:00 - 14:00 | 0 | 0 | 0 | 0 |
| 25.07.2017 14:00 - 15:00 | 0 | 0 | 0 | 0 |
| 25.07.2017 15:00 - 16:00 | 0 | 0 | 0 | 0 |
| 25.07.2017 16:00 - 17:00 | 0 | 0 | 0 | 0 |
| 25.07.2017 17:00 - 18:00 | 0 | 0 | 0 | 0 |
| 25.07.2017 18:00 - 19:00 | 0 | 0 | 0 | 0 |
| 25.07.2017 19:00 - 20:00 | 0 | 0 | 0 | 0 |
| 25.07.2017 20:00 - 21:00 | 0 | 0 | 0 | 0 |
| 25.07.2017 21:00 - 22:00 | 0 | 0 | 0 | 0 |
| 25.07.2017 22:00 - 23:00 | 0 | 0 | 0 | 0 |
| 25.07.2017 23:00 - 24:00 | 0 | 0 | 0 | 0 |
| 26.07.2017 00:00 - 01:00 | 0 | 0 | 0 | 0 |
| 26.07.2017 01:00 - 02:00 | 0 | 0 | 0 | 0 |
| 26.07.2017 02:00 - 03:00 | 0 | 0 | 0 | 0 |
| 26.07.2017 03:00 - 04:00 | 0 | 0 | 0 | 0 |
| 26.07.2017 04:00 - 05:00 | 0 | 0 | 0 | 0 |
| 26.07.2017 05:00 - 06:00 | 0 | 0 | 0 | 0 |
| 26.07.2017 06:00 - 07:00 | 0 | 0 | 0 | 0 |
| 26.07.2017 07:00 - 08:00 | 0 | 0 | 0 | 0 |
| 26.07.2017 08:00 - 09:00 | 0 | 0 | 0 | 0 |
| 26.07.2017 09:00 - 10:00 | 0 | 0 | 0 | 0 |
| 26.07.2017 10:00 - 11:00 | 0 | 0 | 0 | 0 |
| 26.07.2017 11:00 - 12:00 | 0 | 0 | 0 | 0 |
| 26.07.2017 12:00 - 13:00 | 0 | 0 | 0 | 0 |
| 26.07.2017 13:00 - 14:00 | 0 | 0 | 0 | 0 |
| 26.07.2017 14:00 - 15:00 | 0 | 0 | 0 | 0 |
| 26.07.2017 15:00 - 16:00 | 0 | 0 | 0 | 0 |
| 26.07.2017 16:00 - 17:00 | 0 | 0 | 0 | 0 |
| 26.07.2017 17:00 - 18:00 | 0 | 0 | 0 | 0 |
| 26.07.2017 18:00 - 19:00 | 0 | 0 | 0 | 0 |
| 26.07.2017 19:00 - 20:00 | 0 | 0 | 0 | 0 |
| 26.07.2017 20:00 - 21:00 | 0 | 0 | 0 | 0 |
| 26.07.2017 21:00 - 22:00 | 0 | 0 | 0 | 0 |
| 26.07.2017 22:00 - 23:00 | 0 | 0 | 0 | 0 |
| 26.07.2017 23:00 - 24:00 | 0 | 0 | 0 | 0 |
| 27.07.2017 00:00 - 01:00 | 0 | 0 | 0 | 0 |
| 27.07.2017 01:00 - 02:00 | 0 | 0 | 0 | 0 |
| 27.07.2017 02:00 - 03:00 | 0 | 0 | 0 | 0 |
| 27.07.2017 03:00 - 04:00 | 0 | 0 | 0 | 0 |
| 27.07.2017 04:00 - 05:00 | 0 | 0 | 0 | 0 |
| 27.07.2017 05:00 - 06:00 | 0 | 0 | 0 | 0 |
| 27.07.2017 06:00 - 07:00 | 0 | 0 | 0 | 0 |
| 27.07.2017 07:00 - 08:00 | 0 | 0 | 0 | 0 |
| 27.07.2017 08:00 - 09:00 | 0 | 0 | 0 | 0 |
| 27.07.2017 09:00 - 10:00 | 0 | 0 | 0 | 0 |
| 27.07.2017 10:00 - 11:00 | 0 | 0 | 0 | 0 |
| 27.07.2017 11:00 - 12:00 | 0 | 0 | 0 | 0 |
| 27.07.2017 12:00 - 13:00 | 0 | 0 | 0 | 0 |
| 27.07.2017 13:00 - 14:00 | 0 | 0 | 0 | 0 |
| 27.07.2017 14:00 - 15:00 | 0 | 0 | 0 | 0 |
| 27.07.2017 15:00 - 16:00 | 0 | 0 | 0 | 0 |
| 27.07.2017 16:00 - 17:00 | 0 | 0 | 0 | 0 |
| 27.07.2017 17:00 - 18:00 | 0 | 0 | 0 | 0 |
| 27.07.2017 18:00 - 19:00 | 0 | 0 | 0 | 0 |
| 27.07.2017 19:00 - 20:00 | 0 | 0 | 0 | 0 |
| 27.07.2017 20:00 - 21:00 | 0 | 0 | 0 | 0 |
| 27.07.2017 21:00 - 22:00 | 0 | 0 | 0 | 0 |
| 27.07.2017 22:00 - 23:00 | 0 | 0 | 0 | 0 |
| 27.07.2017 23:00 - 24:00 | 0 | 0 | 0 | 0 |
| 28.07.2017 00:00 - 01:00 | 0 | 0 | 0 | 0 |
| 28.07.2017 01:00 - 02:00 | 0 | 0 | 0 | 0 |
| 28.07.2017 02:00 - 03:00 | 0 | 0 | 0 | 0 |
| 28.07.2017 03:00 - 04:00 | 0 | 0 | 0 | 0 |
| 28.07.2017 04:00 - 05:00 | 0 | 0 | 0 | 0 |
| 28.07.2017 05:00 - 06:00 | 0 | 0 | 0 | 0 |
| 28.07.2017 06:00 - 07:00 | 0 | 0 | 0 | 0 |
| 28.07.2017 07:00 - 08:00 | 0 | 0 | 0 | 0 |
| 28.07.2017 08:00 - 09:00 | 0 | 0 | 0 | 0 |
| 28.07.2017 09:00 - 10:00 | 0 | 0 | 0 | 0 |
| 28.07.2017 10:00 - 11:00 | 0 | 0 | 0 | 0 |
| 28.07.2017 11:00 - 12:00 | 0 | 0 | 0 | 0 |
| 28.07.2017 12:00 - 13:00 | 0 | 0 | 0 | 0 |
| 28.07.2017 13:00 - 14:00 | 0 | 0 | 0 | 0 |
| 28.07.2017 14:00 - 15:00 | 0 | 0 | 0 | 0 |
| 28.07.2017 15:00 - 16:00 | 0 | 0 | 0 | 0 |
| 28.07.2017 16:00 - 17:00 | 0 | 0 | 0 | 0 |
| 28.07.2017 17:00 - 18:00 | 0 | 0 | 0 | 0 |
| 28.07.2017 18:00 - 19:00 | 0 | 0 | 0 | 0 |
| 28.07.2017 19:00 - 20:00 | 0 | 0 | 0 | 0 |
| 28.07.2017 20:00 - 21:00 | 0 | 0 | 0 | 0 |
| 28.07.2017 21:00 - 22:00 | 0 | 0 | 0 | 0 |
| 28.07.2017 22:00 - 23:00 | 0 | 0 | 0 | 0 |
| 28.07.2017 23:00 - 24:00 | 0 | 0 | 0 | 0 |
| 29.07.2017 00:00 - 01:00 | 0 | 0 | 0 | 0 |
| 29.07.2017 01:00 - 02:00 | 0 | 0 | 0 | 0 |
| 29.07.2017 02:00 - 03:00 | 0 | 0 | 0 | 0 |
| 29.07.2017 03:00 - 04:00 | 0 | 0 | 0 | 0 |
| 29.07.2017 04:00 - 05:00 | 0 | 0 | 0 | 0 |
| 29.07.2017 05:00 - 06:00 | 0 | 0 | 0 | 0 |
| 29.07.2017 06:00 - 07:00 | 0 | 0 | 0 | 0 |
| 29.07.2017 07:00 - 08:00 | 0 | 0 | 0 | 0 |
| 29.07.2017 08:00 - 09:00 | 0 | 0 | 0 | 0 |
| 29.07.2017 09:00 - 10:00 | 0 | 0 | 0 | 0 |
| 29.07.2017 10:00 - 11:00 | 0 | 0 | 0 | 0 |
| 29.07.2017 11:00 - 12:00 | 0 | 0 | 0 | 0 |
| 29.07.2017 12:00 - 13:00 | 0 | 0 | 0 | 0 |
| 29.07.2017 13:00 - 14:00 | 0 | 0 | 0 | 0 |
| 29.07.2017 14:00 - 15:00 | 0 | 0 | 0 | 0 |
| 29.07.2017 15:00 - 16:00 | 0 | 0 | 0 | 0 |
| 29.07.2017 16:00 - 17:00 | 0 | 0 | 0 | 0 |
| 29.07.2017 17:00 - 18:00 | 0 | 0 | 0 | 0 |
| 29.07.2017 18:00 - 19:00 | 0 | 0 | 0 | 0 |
| 29.07.2017 19:00 - 20:00 | 0 | 0 | 0 | 0 |
| 29.07.2017 20:00 - 21:00 | 0 | 0 | 0 | 0 |
| 29.07.2017 21:00 - 22:00 | 0 | 0 | 0 | 0 |
| 29.07.2017 22:00 - 23:00 | 0 | 0 | 0 | 0 |
| 29.07.2017 23:00 - 24:00 | 0 | 0 | 0 | 0 |
| 30.07.2017 00:00 - 01:00 | 0 | 0 | 0 | 0 |
| 30.07.2017 01:00 - 02:00 | 0 | -400 | 0 | 0 |
| 30.07.2017 02:00 - 03:00 | 0 | -400 | 0 | 0 |
| 30.07.2017 03:00 - 04:00 | 0 | -400 | 0 | 0 |
| 30.07.2017 04:00 - 05:00 | 0 | -400 | 0 | 0 |
| 30.07.2017 05:00 - 06:00 | 0 | -400 | 0 | 0 |
| 30.07.2017 06:00 - 07:00 | 0 | 0 | 0 | 0 |
| 30.07.2017 07:00 - 08:00 | 0 | 0 | 0 | 0 |
| 30.07.2017 08:00 - 09:00 | 0 | 0 | 0 | 0 |
| 30.07.2017 09:00 - 10:00 | 0 | 0 | 0 | 0 |
| 30.07.2017 10:00 - 11:00 | 0 | 0 | 0 | 0 |
| 30.07.2017 11:00 - 12:00 | 0 | 0 | 0 | 0 |
| 30.07.2017 12:00 - 13:00 | 0 | 0 | 0 | 0 |
| 30.07.2017 13:00 - 14:00 | 0 | 0 | 0 | 0 |
| 30.07.2017 14:00 - 15:00 | 0 | 0 | 0 | 0 |
| 30.07.2017 15:00 - 16:00 | 0 | 0 | 0 | 0 |
| 30.07.2017 16:00 - 17:00 | 0 | 0 | 0 | 0 |
| 30.07.2017 17:00 - 18:00 | 0 | 0 | 0 | 0 |
| 30.07.2017 18:00 - 19:00 | 0 | 0 | 0 | 0 |
| 30.07.2017 19:00 - 20:00 | 0 | 0 | 0 | 0 |
| 30.07.2017 20:00 - 21:00 | 0 | 0 | 0 | 0 |
| 30.07.2017 21:00 - 22:00 | 0 | 0 | 0 | 0 |
| 30.07.2017 22:00 - 23:00 | 0 | 0 | 0 | 0 |
| 30.07.2017 23:00 - 24:00 | 0 | 0 | 0 | 0 |
| 31.07.2017 00:00 - 01:00 | 0 | 0 | 0 | 0 |
| 31.07.2017 01:00 - 02:00 | 0 | -500 | 0 | 0 |
| 31.07.2017 02:00 - 03:00 | 0 | -500 | 0 | 0 |
| 31.07.2017 03:00 - 04:00 | 0 | -500 | 0 | 0 |
| 31.07.2017 04:00 - 05:00 | 0 | -500 | 0 | 0 |
| 31.07.2017 05:00 - 06:00 | 0 | -500 | 0 | 0 |
| 31.07.2017 06:00 - 07:00 | 0 | 0 | 0 | 0 |
| 31.07.2017 07:00 - 08:00 | 0 | 0 | 0 | 0 |
| 31.07.2017 08:00 - 09:00 | 0 | 0 | 0 | 0 |
| 31.07.2017 09:00 - 10:00 | 0 | 0 | 0 | 0 |
| 31.07.2017 10:00 - 11:00 | 0 | 0 | 0 | 0 |
| 31.07.2017 11:00 - 12:00 | 0 | 0 | 0 | 0 |
| 31.07.2017 12:00 - 13:00 | 0 | 0 | 0 | 0 |
| 31.07.2017 13:00 - 14:00 | 0 | -300 | 0 | 0 |
| 31.07.2017 14:00 - 15:00 | 0 | -300 | 0 | 0 |
| 31.07.2017 15:00 - 16:00 | 0 | -300 | 0 | 0 |
| 31.07.2017 16:00 - 17:00 | 0 | -300 | 0 | 0 |
| 31.07.2017 17:00 - 18:00 | 0 | -300 | 0 | 0 |
| 31.07.2017 18:00 - 19:00 | 0 | -300 | 0 | 0 |
| 31.07.2017 19:00 - 20:00 | 0 | -300 | 0 | 0 |
| 31.07.2017 20:00 - 21:00 | 0 | -300 | 0 | 0 |
| 31.07.2017 21:00 - 22:00 | 0 | -300 | 0 | 0 |
| 31.07.2017 22:00 - 23:00 | 0 | -300 | 0 | 0 |
| 31.07.2017 23:00 - 24:00 | 0 | -300 | 0 | 0 |
| 01.08.2017 00:00 - 01:00 | 0 | -300 | 0 | 0 |
| 01.08.2017 01:00 - 02:00 | 0 | -300 | 0 | 0 |
| 01.08.2017 02:00 - 03:00 | 0 | -800 | 0 | 0 |
| 01.08.2017 03:00 - 04:00 | 0 | -800 | 0 | 0 |
| 01.08.2017 04:00 - 05:00 | 0 | -800 | 0 | 0 |
| 01.08.2017 05:00 - 06:00 | 0 | -800 | 0 | 0 |